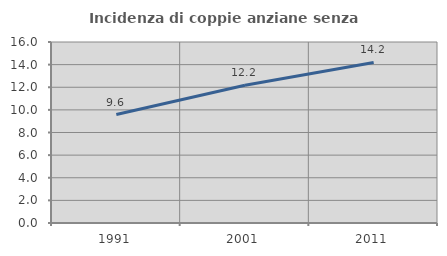
| Category | Incidenza di coppie anziane senza figli  |
|---|---|
| 1991.0 | 9.589 |
| 2001.0 | 12.172 |
| 2011.0 | 14.193 |